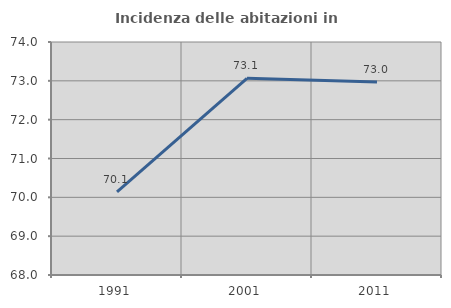
| Category | Incidenza delle abitazioni in proprietà  |
|---|---|
| 1991.0 | 70.143 |
| 2001.0 | 73.065 |
| 2011.0 | 72.967 |